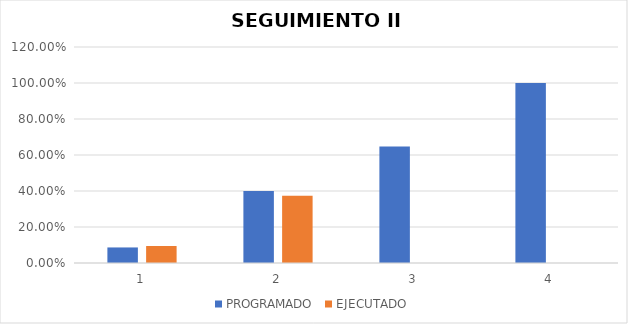
| Category | PROGRAMADO | EJECUTADO |
|---|---|---|
| 0 | 0.086 | 0.094 |
| 1 | 0.4 | 0.373 |
| 2 | 0.647 | 0 |
| 3 | 1 | 0 |